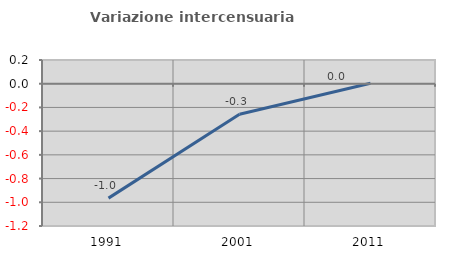
| Category | Variazione intercensuaria annua |
|---|---|
| 1991.0 | -0.965 |
| 2001.0 | -0.258 |
| 2011.0 | 0.004 |